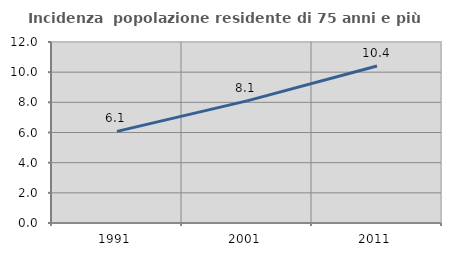
| Category | Incidenza  popolazione residente di 75 anni e più |
|---|---|
| 1991.0 | 6.073 |
| 2001.0 | 8.098 |
| 2011.0 | 10.409 |